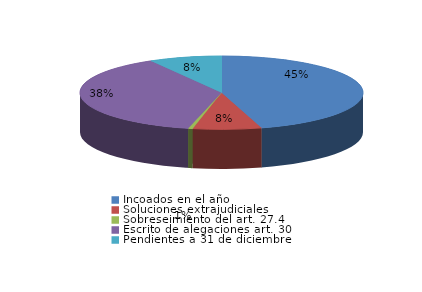
| Category | Series 0 |
|---|---|
| Incoados en el año | 175 |
| Soluciones extrajudiciales | 30 |
| Sobreseimiento del art. 27.4 | 2 |
| Escrito de alegaciones art. 30 | 146 |
| Pendientes a 31 de diciembre | 32 |